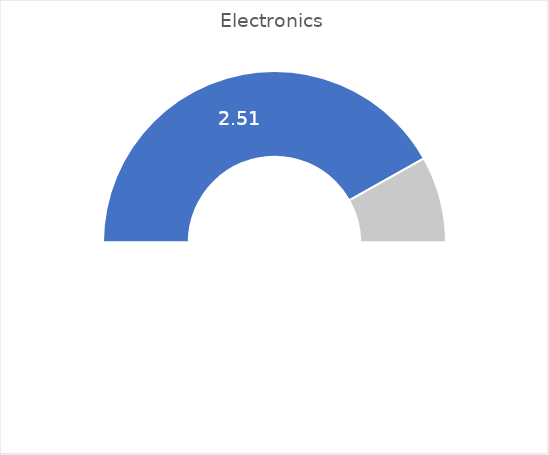
| Category | Series 0 |
|---|---|
| 0 | 0.837 |
| 1 | 0.163 |
| 2 | 1 |